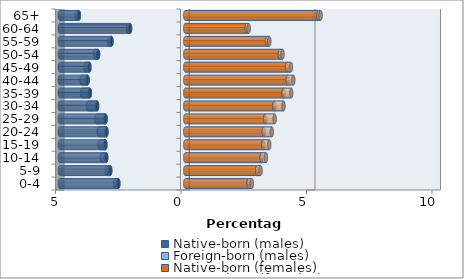
| Category | Native-born (males) | Foreign-born (males) | Native-born (females) | Foreign-born (females) |
|---|---|---|---|---|
| 0-4 | -2.666 | -0.131 | 2.526 | 0.126 |
| 5-9 | -2.989 | -0.143 | 2.863 | 0.14 |
| 10-14 | -3.148 | -0.175 | 3.043 | 0.173 |
| 15-19 | -3.181 | -0.234 | 3.112 | 0.234 |
| 20-24 | -3.14 | -0.314 | 3.133 | 0.317 |
| 25-29 | -3.173 | -0.369 | 3.19 | 0.372 |
| 30-34 | -3.512 | -0.36 | 3.556 | 0.358 |
| 35-39 | -3.801 | -0.311 | 3.921 | 0.301 |
| 40-44 | -3.891 | -0.233 | 4.082 | 0.222 |
| 45-49 | -3.819 | -0.159 | 4.06 | 0.151 |
| 50-54 | -3.473 | -0.111 | 3.77 | 0.105 |
| 55-59 | -2.94 | -0.09 | 3.263 | 0.087 |
| 60-64 | -2.2 | -0.084 | 2.449 | 0.081 |
| 65+ | -4.239 | -0.087 | 5.308 | 0.085 |